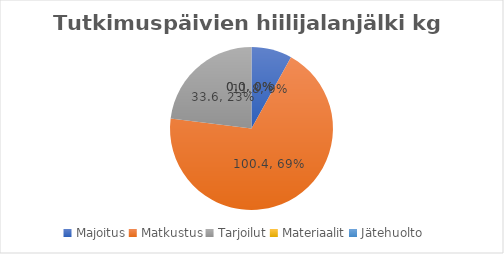
| Category | Tutkimuspäivien hiilijalanjälki kg CO2ekv |
|---|---|
| Majoitus | 11.75 |
| Matkustus | 100.425 |
| Tarjoilut | 33.574 |
| Materiaalit | 0.008 |
| Jätehuolto | 0 |